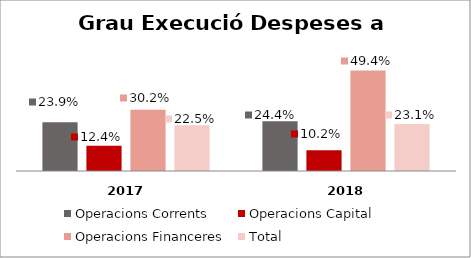
| Category | Operacions Corrents | Operacions Capital | Operacions Financeres | Total |
|---|---|---|---|---|
| 0 | 0.239 | 0.124 | 0.302 | 0.225 |
| 1 | 0.244 | 0.102 | 0.494 | 0.231 |